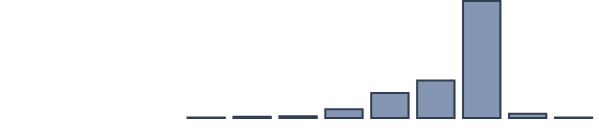
| Category | Series 0 |
|---|---|
| 0 | 0 |
| 1 | 0 |
| 2 | 0 |
| 3 | 0 |
| 4 | 0.2 |
| 5 | 0.6 |
| 6 | 0.9 |
| 7 | 4.5 |
| 8 | 12.7 |
| 9 | 19.1 |
| 10 | 59.5 |
| 11 | 2.2 |
| 12 | 0.2 |